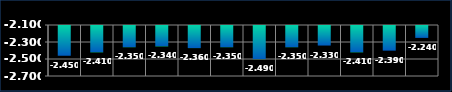
| Category | Series 0 |
|---|---|
| 0 | -2.45 |
| 1 | -2.41 |
| 2 | -2.35 |
| 3 | -2.34 |
| 4 | -2.36 |
| 5 | -2.35 |
| 6 | -2.49 |
| 7 | -2.35 |
| 8 | -2.33 |
| 9 | -2.41 |
| 10 | -2.39 |
| 11 | -2.24 |